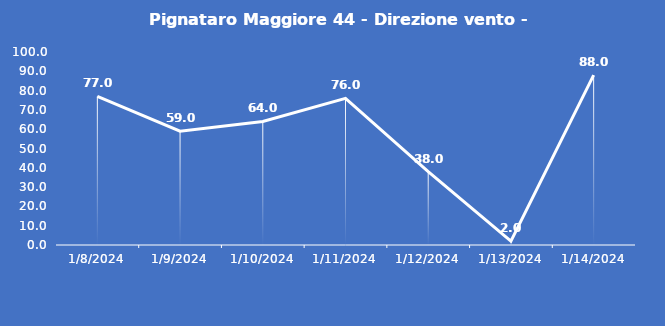
| Category | Pignataro Maggiore 44 - Direzione vento - Grezzo (°N) |
|---|---|
| 1/8/24 | 77 |
| 1/9/24 | 59 |
| 1/10/24 | 64 |
| 1/11/24 | 76 |
| 1/12/24 | 38 |
| 1/13/24 | 2 |
| 1/14/24 | 88 |